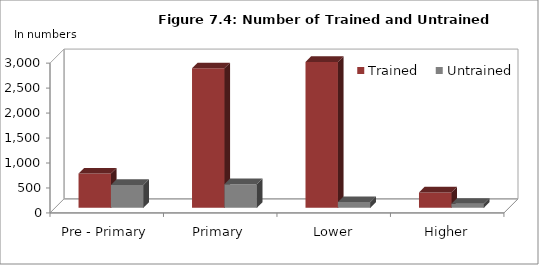
| Category | Trained | Untrained |
|---|---|---|
| Pre - Primary | 685 | 457 |
| Primary | 2793 | 472 |
| Lower Secondary | 2921 | 114 |
| Higher Secondary  | 309 | 79 |